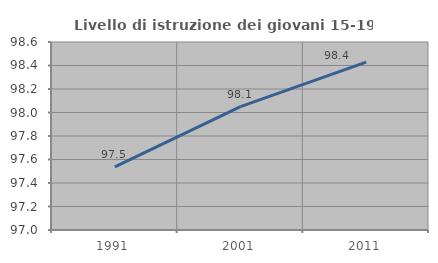
| Category | Livello di istruzione dei giovani 15-19 anni |
|---|---|
| 1991.0 | 97.537 |
| 2001.0 | 98.05 |
| 2011.0 | 98.429 |